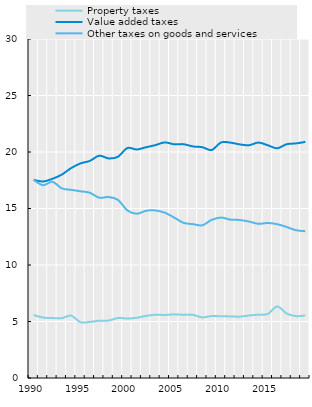
| Category | Property taxes | Value added taxes | Other taxes on goods and services |
|---|---|---|---|
| 1990.0 | 5.568 | 17.536 | 17.53 |
| 1991.0 | 5.349 | 17.39 | 17.061 |
| 1992.0 | 5.304 | 17.625 | 17.362 |
| 1993.0 | 5.292 | 17.996 | 16.782 |
| 1994.0 | 5.519 | 18.577 | 16.65 |
| 1995.0 | 4.936 | 18.989 | 16.526 |
| 1996.0 | 4.967 | 19.215 | 16.389 |
| 1997.0 | 5.067 | 19.675 | 15.954 |
| 1998.0 | 5.081 | 19.434 | 16.014 |
| 1999.0 | 5.309 | 19.581 | 15.759 |
| 2000.0 | 5.26 | 20.348 | 14.833 |
| 2001.0 | 5.33 | 20.223 | 14.539 |
| 2002.0 | 5.497 | 20.419 | 14.798 |
| 2003.0 | 5.595 | 20.61 | 14.83 |
| 2004.0 | 5.581 | 20.848 | 14.628 |
| 2005.0 | 5.631 | 20.681 | 14.198 |
| 2006.0 | 5.596 | 20.691 | 13.73 |
| 2007.0 | 5.594 | 20.492 | 13.619 |
| 2008.0 | 5.362 | 20.427 | 13.512 |
| 2009.0 | 5.489 | 20.177 | 13.993 |
| 2010.0 | 5.462 | 20.84 | 14.197 |
| 2011.0 | 5.452 | 20.829 | 14.015 |
| 2012.0 | 5.431 | 20.674 | 13.983 |
| 2013.0 | 5.534 | 20.601 | 13.842 |
| 2014.0 | 5.604 | 20.835 | 13.646 |
| 2015.0 | 5.664 | 20.594 | 13.72 |
| 2016.0 | 6.329 | 20.33 | 13.611 |
| 2017.0 | 5.711 | 20.687 | 13.366 |
| 2018.0 | 5.477 | 20.759 | 13.078 |
| 2019.0 | 5.534 | 20.892 | 12.992 |